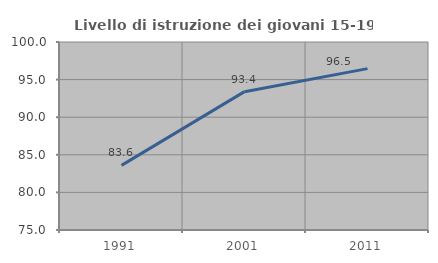
| Category | Livello di istruzione dei giovani 15-19 anni |
|---|---|
| 1991.0 | 83.594 |
| 2001.0 | 93.396 |
| 2011.0 | 96.46 |